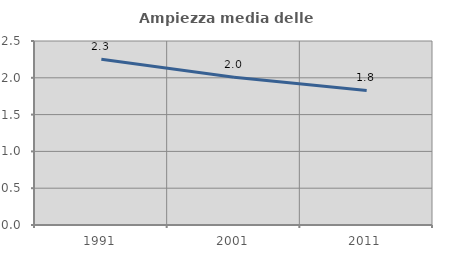
| Category | Ampiezza media delle famiglie |
|---|---|
| 1991.0 | 2.253 |
| 2001.0 | 2.008 |
| 2011.0 | 1.829 |